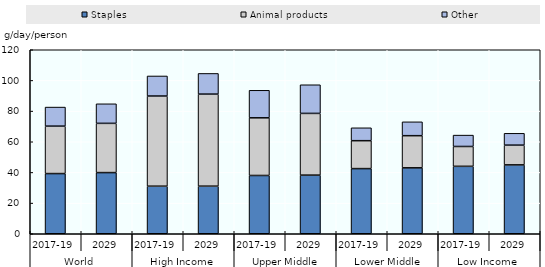
| Category | Staples | Animal products | Other |
|---|---|---|---|
| 0 | 39.246 | 30.944 | 12.428 |
| 1 | 39.888 | 32.108 | 12.764 |
| 2 | 31.028 | 58.789 | 13.091 |
| 3 | 31.038 | 60.037 | 13.48 |
| 4 | 38.006 | 37.598 | 17.957 |
| 5 | 38.239 | 40.249 | 18.683 |
| 6 | 42.49 | 18.209 | 8.404 |
| 7 | 42.985 | 20.973 | 9.036 |
| 8 | 43.978 | 12.935 | 7.424 |
| 9 | 44.915 | 12.877 | 7.718 |